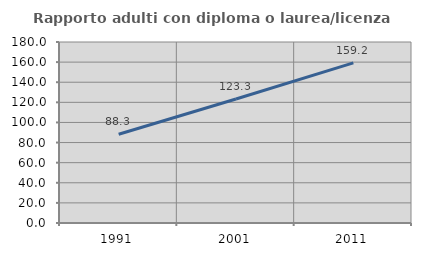
| Category | Rapporto adulti con diploma o laurea/licenza media  |
|---|---|
| 1991.0 | 88.268 |
| 2001.0 | 123.302 |
| 2011.0 | 159.241 |